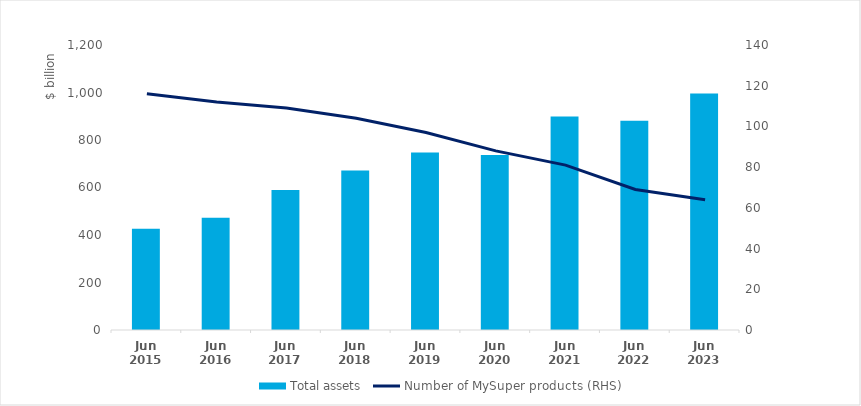
| Category | Total assets  |
|---|---|
| Jun 2015 | 426.3 |
| Jun 2016 | 472.4 |
| Jun 2017 | 589.5 |
| Jun 2018 | 671.8 |
| Jun 2019 | 747.6 |
| Jun 2020 | 737 |
| Jun 2021 | 898.6 |
| Jun 2022 | 881.3 |
| Jun 2023 | 995.3 |